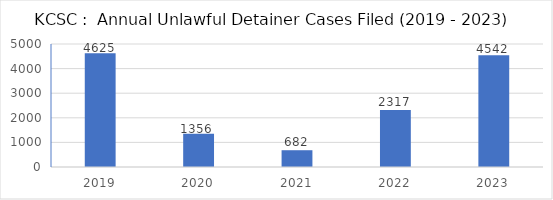
| Category | Series 0 |
|---|---|
| 2019.0 | 4625 |
| 2020.0 | 1356 |
| 2021.0 | 682 |
| 2022.0 | 2317 |
| 2023.0 | 4542 |